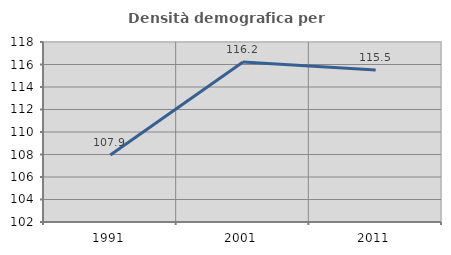
| Category | Densità demografica |
|---|---|
| 1991.0 | 107.949 |
| 2001.0 | 116.227 |
| 2011.0 | 115.502 |